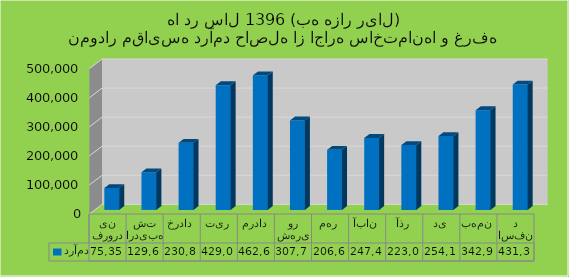
| Category | درآمد |
|---|---|
| فروردین | 75352 |
| اردیبهشت | 129603 |
| خرداد | 230841 |
| تیر | 429060 |
| مرداد | 462642 |
| شهریور | 307720 |
| مهر | 206695 |
| آبان | 247471 |
| آذر | 223026 |
| دی | 254190 |
| بهمن | 342900 |
| اسفند | 431330 |